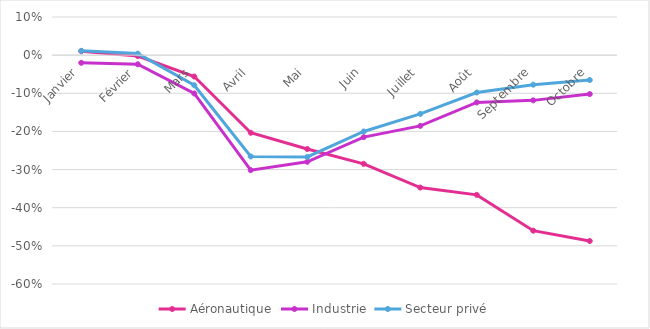
| Category | Aéronautique | Industrie | Secteur privé |
|---|---|---|---|
| Janvier | 0.01 | -0.02 | 0.011 |
| Février | -0.002 | -0.024 | 0.004 |
| Mars | -0.056 | -0.1 | -0.079 |
| Avril | -0.204 | -0.302 | -0.266 |
| Mai | -0.246 | -0.28 | -0.267 |
| Juin | -0.285 | -0.215 | -0.2 |
| Juillet | -0.347 | -0.186 | -0.154 |
| Août | -0.366 | -0.124 | -0.098 |
| Septembre | -0.46 | -0.119 | -0.077 |
| Octobre | -0.487 | -0.102 | -0.065 |